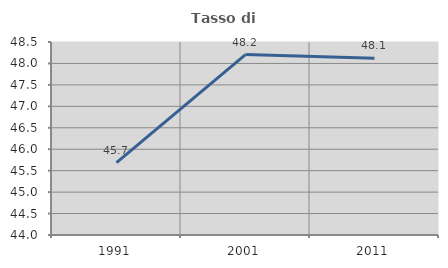
| Category | Tasso di occupazione   |
|---|---|
| 1991.0 | 45.689 |
| 2001.0 | 48.208 |
| 2011.0 | 48.121 |